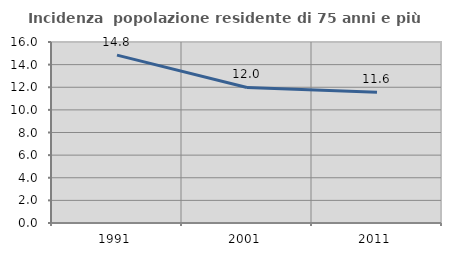
| Category | Incidenza  popolazione residente di 75 anni e più |
|---|---|
| 1991.0 | 14.842 |
| 2001.0 | 11.981 |
| 2011.0 | 11.568 |